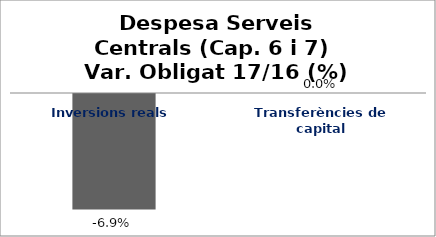
| Category | Series 0 |
|---|---|
| Inversions reals | -0.069 |
| Transferències de capital | 0 |